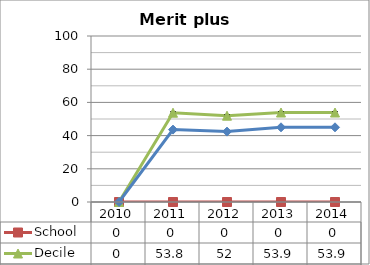
| Category | School  | Decile | National |
|---|---|---|---|
| 2010.0 | 0 | 0 | 0 |
| 2011.0 | 0 | 53.8 | 43.6 |
| 2012.0 | 0 | 52 | 42.4 |
| 2013.0 | 0 | 53.9 | 45 |
| 2014.0 | 0 | 53.9 | 45 |